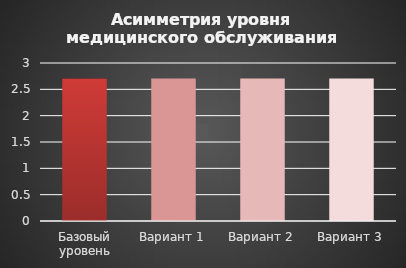
| Category | Асимметрия уровня медицинского обслуживания |
|---|---|
| Базовый уровень | 2.704 |
| Вариант 1 | 2.704 |
| Вариант 2 | 2.704 |
| Вариант 3 | 2.704 |